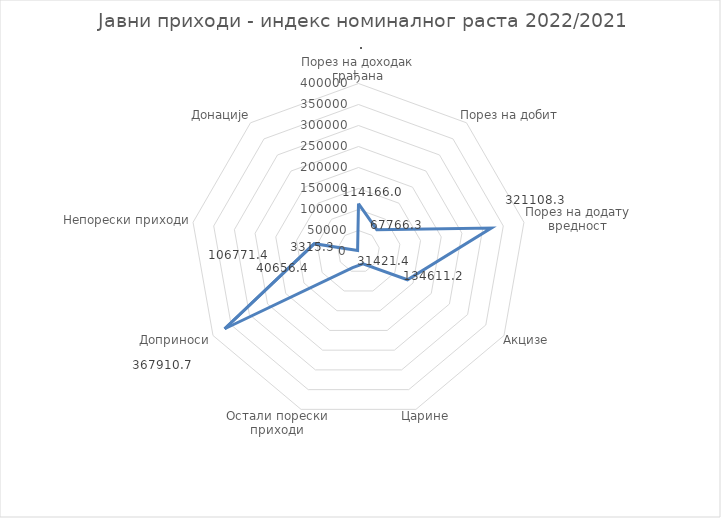
| Category | Series 0 |
|---|---|
| Порез на доходак грађана | 114165.965 |
| Порез на добит  | 67766.343 |
| Порез на додату вредност | 321108.301 |
| Акцизе | 134611.183 |
| Царине | 31421.397 |
| Остали порески приходи | 40656.367 |
| Доприноси | 367910.693 |
| Непорески приходи | 106771.397 |
| Донације | 3315.334 |